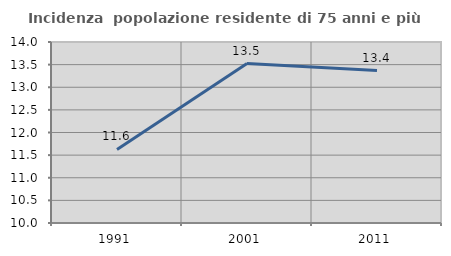
| Category | Incidenza  popolazione residente di 75 anni e più |
|---|---|
| 1991.0 | 11.625 |
| 2001.0 | 13.523 |
| 2011.0 | 13.368 |